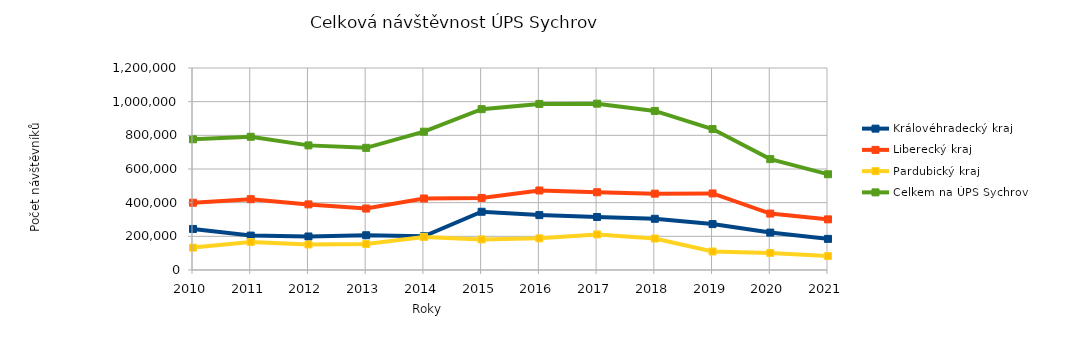
| Category | Královéhradecký kraj | Liberecký kraj | Pardubický kraj | Celkem na ÚPS Sychrov |
|---|---|---|---|---|
| 2010.0 | 243910 | 399672 | 133004 | 776586 |
| 2011.0 | 204481 | 420780 | 166238 | 791499 |
| 2012.0 | 199025 | 389781 | 151509 | 740315 |
| 2013.0 | 206419 | 365108 | 154165 | 725692 |
| 2014.0 | 200438 | 424718 | 196473 | 821629 |
| 2015.0 | 345970 | 428023 | 181567 | 955560 |
| 2016.0 | 326137 | 472318 | 188108 | 986563 |
| 2017.0 | 314983 | 461803 | 211268 | 988054 |
| 2018.0 | 304267 | 453568 | 187017 | 944852 |
| 2019.0 | 272720 | 454785 | 109949 | 837454 |
| 2020.0 | 222238 | 335261 | 101211 | 658710 |
| 2021.0 | 184955 | 300830 | 82856 | 568641 |